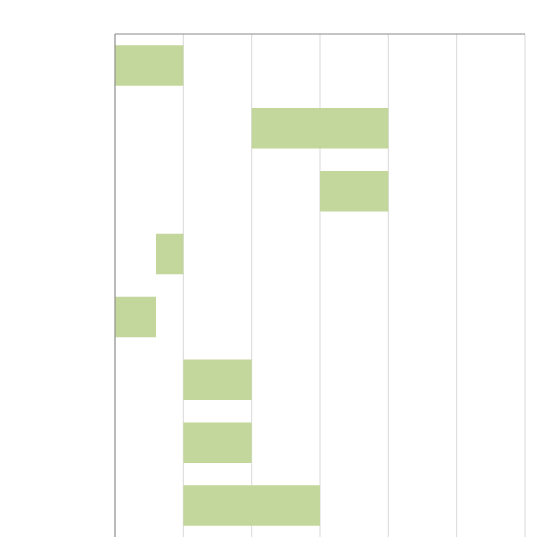
| Category | Series 0 | Series 1 |
|---|---|---|
|  | 0 | 0.05 |
|  | 0.1 | 0.1 |
|  | 0.15 | 0.05 |
|  | 0.03 | 0.02 |
|  | 0 | 0.03 |
|                                   | 0.05 | 0.05 |